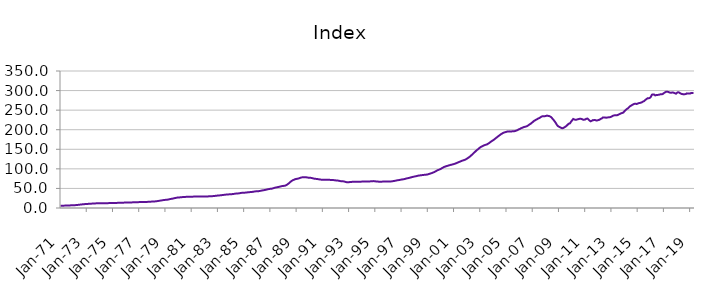
| Category | Index |
|---|---|
| 1971-01-01 | 5.879 |
| 1971-02-01 | 5.921 |
| 1971-03-01 | 5.963 |
| 1971-04-01 | 6.018 |
| 1971-05-01 | 6.108 |
| 1971-06-01 | 6.203 |
| 1971-07-01 | 6.32 |
| 1971-08-01 | 6.446 |
| 1971-09-01 | 6.572 |
| 1971-10-01 | 6.703 |
| 1971-11-01 | 6.844 |
| 1971-12-01 | 7.015 |
| 1972-01-01 | 7.135 |
| 1972-02-01 | 7.213 |
| 1972-03-01 | 7.39 |
| 1972-04-01 | 7.638 |
| 1972-05-01 | 7.997 |
| 1972-06-01 | 8.312 |
| 1972-07-01 | 8.674 |
| 1972-08-01 | 9.023 |
| 1972-09-01 | 9.332 |
| 1972-10-01 | 9.62 |
| 1972-11-01 | 9.887 |
| 1972-12-01 | 10.162 |
| 1973-01-01 | 10.359 |
| 1973-02-01 | 10.498 |
| 1973-03-01 | 10.658 |
| 1973-04-01 | 10.841 |
| 1973-05-01 | 11.075 |
| 1973-06-01 | 11.227 |
| 1973-07-01 | 11.386 |
| 1973-08-01 | 11.562 |
| 1973-09-01 | 11.768 |
| 1973-10-01 | 11.982 |
| 1973-11-01 | 12.145 |
| 1973-12-01 | 12.262 |
| 1974-01-01 | 12.324 |
| 1974-02-01 | 12.392 |
| 1974-03-01 | 12.389 |
| 1974-04-01 | 12.362 |
| 1974-05-01 | 12.339 |
| 1974-06-01 | 12.34 |
| 1974-07-01 | 12.352 |
| 1974-08-01 | 12.392 |
| 1974-09-01 | 12.465 |
| 1974-10-01 | 12.555 |
| 1974-11-01 | 12.63 |
| 1974-12-01 | 12.703 |
| 1975-01-01 | 12.737 |
| 1975-02-01 | 12.78 |
| 1975-03-01 | 12.857 |
| 1975-04-01 | 12.965 |
| 1975-05-01 | 13.097 |
| 1975-06-01 | 13.168 |
| 1975-07-01 | 13.237 |
| 1975-08-01 | 13.332 |
| 1975-09-01 | 13.462 |
| 1975-10-01 | 13.606 |
| 1975-11-01 | 13.732 |
| 1975-12-01 | 13.867 |
| 1976-01-01 | 13.963 |
| 1976-02-01 | 14.052 |
| 1976-03-01 | 14.114 |
| 1976-04-01 | 14.179 |
| 1976-05-01 | 14.264 |
| 1976-06-01 | 14.32 |
| 1976-07-01 | 14.382 |
| 1976-08-01 | 14.474 |
| 1976-09-01 | 14.605 |
| 1976-10-01 | 14.752 |
| 1976-11-01 | 14.87 |
| 1976-12-01 | 14.976 |
| 1977-01-01 | 15.034 |
| 1977-02-01 | 15.102 |
| 1977-03-01 | 15.145 |
| 1977-04-01 | 15.197 |
| 1977-05-01 | 15.276 |
| 1977-06-01 | 15.347 |
| 1977-07-01 | 15.436 |
| 1977-08-01 | 15.557 |
| 1977-09-01 | 15.705 |
| 1977-10-01 | 15.871 |
| 1977-11-01 | 16.048 |
| 1977-12-01 | 16.278 |
| 1978-01-01 | 16.449 |
| 1978-02-01 | 16.582 |
| 1978-03-01 | 16.762 |
| 1978-04-01 | 17.003 |
| 1978-05-01 | 17.391 |
| 1978-06-01 | 17.783 |
| 1978-07-01 | 18.258 |
| 1978-08-01 | 18.744 |
| 1978-09-01 | 19.213 |
| 1978-10-01 | 19.678 |
| 1978-11-01 | 20.113 |
| 1978-12-01 | 20.542 |
| 1979-01-01 | 20.797 |
| 1979-02-01 | 20.968 |
| 1979-03-01 | 21.394 |
| 1979-04-01 | 21.979 |
| 1979-05-01 | 22.725 |
| 1979-06-01 | 23.198 |
| 1979-07-01 | 23.69 |
| 1979-08-01 | 24.243 |
| 1979-09-01 | 24.906 |
| 1979-10-01 | 25.613 |
| 1979-11-01 | 26.202 |
| 1979-12-01 | 26.66 |
| 1980-01-01 | 26.911 |
| 1980-02-01 | 27.107 |
| 1980-03-01 | 27.357 |
| 1980-04-01 | 27.651 |
| 1980-05-01 | 27.994 |
| 1980-06-01 | 28.178 |
| 1980-07-01 | 28.344 |
| 1980-08-01 | 28.498 |
| 1980-09-01 | 28.607 |
| 1980-10-01 | 28.676 |
| 1980-11-01 | 28.73 |
| 1980-12-01 | 28.843 |
| 1981-01-01 | 28.911 |
| 1981-02-01 | 29.013 |
| 1981-03-01 | 29.116 |
| 1981-04-01 | 29.254 |
| 1981-05-01 | 29.394 |
| 1981-06-01 | 29.441 |
| 1981-07-01 | 29.464 |
| 1981-08-01 | 29.469 |
| 1981-09-01 | 29.414 |
| 1981-10-01 | 29.312 |
| 1981-11-01 | 29.219 |
| 1981-12-01 | 29.209 |
| 1982-01-01 | 29.164 |
| 1982-02-01 | 29.184 |
| 1982-03-01 | 29.346 |
| 1982-04-01 | 29.618 |
| 1982-05-01 | 29.924 |
| 1982-06-01 | 30.035 |
| 1982-07-01 | 30.119 |
| 1982-08-01 | 30.28 |
| 1982-09-01 | 30.54 |
| 1982-10-01 | 30.849 |
| 1982-11-01 | 31.157 |
| 1982-12-01 | 31.538 |
| 1983-01-01 | 31.828 |
| 1983-02-01 | 32.078 |
| 1983-03-01 | 32.337 |
| 1983-04-01 | 32.659 |
| 1983-05-01 | 33.081 |
| 1983-06-01 | 33.413 |
| 1983-07-01 | 33.773 |
| 1983-08-01 | 34.116 |
| 1983-09-01 | 34.39 |
| 1983-10-01 | 34.614 |
| 1983-11-01 | 34.826 |
| 1983-12-01 | 35.104 |
| 1984-01-01 | 35.27 |
| 1984-02-01 | 35.438 |
| 1984-03-01 | 35.758 |
| 1984-04-01 | 36.202 |
| 1984-05-01 | 36.71 |
| 1984-06-01 | 36.936 |
| 1984-07-01 | 37.124 |
| 1984-08-01 | 37.411 |
| 1984-09-01 | 37.87 |
| 1984-10-01 | 38.4 |
| 1984-11-01 | 38.81 |
| 1984-12-01 | 39.095 |
| 1985-01-01 | 39.174 |
| 1985-02-01 | 39.283 |
| 1985-03-01 | 39.552 |
| 1985-04-01 | 39.93 |
| 1985-05-01 | 40.361 |
| 1985-06-01 | 40.527 |
| 1985-07-01 | 40.681 |
| 1985-08-01 | 40.948 |
| 1985-09-01 | 41.393 |
| 1985-10-01 | 41.902 |
| 1985-11-01 | 42.329 |
| 1985-12-01 | 42.671 |
| 1986-01-01 | 42.803 |
| 1986-02-01 | 42.939 |
| 1986-03-01 | 43.335 |
| 1986-04-01 | 43.908 |
| 1986-05-01 | 44.624 |
| 1986-06-01 | 45.057 |
| 1986-07-01 | 45.499 |
| 1986-08-01 | 46.028 |
| 1986-09-01 | 46.692 |
| 1986-10-01 | 47.409 |
| 1986-11-01 | 48.06 |
| 1986-12-01 | 48.667 |
| 1987-01-01 | 49.02 |
| 1987-02-01 | 49.311 |
| 1987-03-01 | 49.944 |
| 1987-04-01 | 50.795 |
| 1987-05-01 | 51.813 |
| 1987-06-01 | 52.387 |
| 1987-07-01 | 52.937 |
| 1987-08-01 | 53.541 |
| 1987-09-01 | 54.197 |
| 1987-10-01 | 54.877 |
| 1987-11-01 | 55.513 |
| 1987-12-01 | 56.172 |
| 1988-01-01 | 56.486 |
| 1988-02-01 | 56.756 |
| 1988-03-01 | 57.701 |
| 1988-04-01 | 59.124 |
| 1988-05-01 | 61.264 |
| 1988-06-01 | 63.424 |
| 1988-07-01 | 65.968 |
| 1988-08-01 | 68.307 |
| 1988-09-01 | 70.109 |
| 1988-10-01 | 71.604 |
| 1988-11-01 | 72.807 |
| 1988-12-01 | 73.875 |
| 1989-01-01 | 74.434 |
| 1989-02-01 | 74.906 |
| 1989-03-01 | 75.707 |
| 1989-04-01 | 76.727 |
| 1989-05-01 | 77.807 |
| 1989-06-01 | 78.279 |
| 1989-07-01 | 78.601 |
| 1989-08-01 | 78.752 |
| 1989-09-01 | 78.622 |
| 1989-10-01 | 78.258 |
| 1989-11-01 | 77.774 |
| 1989-12-01 | 77.38 |
| 1990-01-01 | 77.025 |
| 1990-02-01 | 77.011 |
| 1990-03-01 | 76.482 |
| 1990-04-01 | 75.796 |
| 1990-05-01 | 74.994 |
| 1990-06-01 | 74.611 |
| 1990-07-01 | 74.285 |
| 1990-08-01 | 73.967 |
| 1990-09-01 | 73.52 |
| 1990-10-01 | 73.009 |
| 1990-11-01 | 72.535 |
| 1990-12-01 | 72.334 |
| 1991-01-01 | 72.192 |
| 1991-02-01 | 72.268 |
| 1991-03-01 | 72.153 |
| 1991-04-01 | 72.077 |
| 1991-05-01 | 71.977 |
| 1991-06-01 | 71.933 |
| 1991-07-01 | 71.885 |
| 1991-08-01 | 71.819 |
| 1991-09-01 | 71.705 |
| 1991-10-01 | 71.501 |
| 1991-11-01 | 71.166 |
| 1991-12-01 | 70.813 |
| 1992-01-01 | 70.463 |
| 1992-02-01 | 70.409 |
| 1992-03-01 | 69.918 |
| 1992-04-01 | 69.325 |
| 1992-05-01 | 68.671 |
| 1992-06-01 | 68.457 |
| 1992-07-01 | 68.303 |
| 1992-08-01 | 67.98 |
| 1992-09-01 | 67.29 |
| 1992-10-01 | 66.434 |
| 1992-11-01 | 65.854 |
| 1992-12-01 | 65.871 |
| 1993-01-01 | 66.034 |
| 1993-02-01 | 66.322 |
| 1993-03-01 | 66.581 |
| 1993-04-01 | 66.905 |
| 1993-05-01 | 67.182 |
| 1993-06-01 | 67.213 |
| 1993-07-01 | 67.233 |
| 1993-08-01 | 67.289 |
| 1993-09-01 | 67.247 |
| 1993-10-01 | 67.126 |
| 1993-11-01 | 67.046 |
| 1993-12-01 | 67.281 |
| 1994-01-01 | 67.604 |
| 1994-02-01 | 68.006 |
| 1994-03-01 | 67.991 |
| 1994-04-01 | 67.827 |
| 1994-05-01 | 67.683 |
| 1994-06-01 | 67.696 |
| 1994-07-01 | 67.777 |
| 1994-08-01 | 67.944 |
| 1994-09-01 | 68.21 |
| 1994-10-01 | 68.532 |
| 1994-11-01 | 68.685 |
| 1994-12-01 | 68.595 |
| 1995-01-01 | 68.092 |
| 1995-02-01 | 67.66 |
| 1995-03-01 | 67.497 |
| 1995-04-01 | 67.327 |
| 1995-05-01 | 67.356 |
| 1995-06-01 | 67.213 |
| 1995-07-01 | 67.36 |
| 1995-08-01 | 67.425 |
| 1995-09-01 | 67.463 |
| 1995-10-01 | 67.439 |
| 1995-11-01 | 67.524 |
| 1995-12-01 | 67.607 |
| 1996-01-01 | 67.632 |
| 1996-02-01 | 67.59 |
| 1996-03-01 | 67.814 |
| 1996-04-01 | 68.077 |
| 1996-05-01 | 68.578 |
| 1996-06-01 | 68.945 |
| 1996-07-01 | 69.543 |
| 1996-08-01 | 70.122 |
| 1996-09-01 | 70.708 |
| 1996-10-01 | 71.134 |
| 1996-11-01 | 71.585 |
| 1996-12-01 | 72.224 |
| 1997-01-01 | 72.682 |
| 1997-02-01 | 73.17 |
| 1997-03-01 | 73.587 |
| 1997-04-01 | 74.264 |
| 1997-05-01 | 75.148 |
| 1997-06-01 | 75.819 |
| 1997-07-01 | 76.292 |
| 1997-08-01 | 77.048 |
| 1997-09-01 | 77.723 |
| 1997-10-01 | 78.598 |
| 1997-11-01 | 79.21 |
| 1997-12-01 | 79.988 |
| 1998-01-01 | 80.449 |
| 1998-02-01 | 81.141 |
| 1998-03-01 | 81.745 |
| 1998-04-01 | 82.495 |
| 1998-05-01 | 83.027 |
| 1998-06-01 | 83.355 |
| 1998-07-01 | 83.747 |
| 1998-08-01 | 84.113 |
| 1998-09-01 | 84.484 |
| 1998-10-01 | 84.731 |
| 1998-11-01 | 85.018 |
| 1998-12-01 | 85.363 |
| 1999-01-01 | 85.875 |
| 1999-02-01 | 86.896 |
| 1999-03-01 | 87.796 |
| 1999-04-01 | 88.688 |
| 1999-05-01 | 89.666 |
| 1999-06-01 | 90.701 |
| 1999-07-01 | 91.918 |
| 1999-08-01 | 93.495 |
| 1999-09-01 | 95.101 |
| 1999-10-01 | 96.577 |
| 1999-11-01 | 97.58 |
| 1999-12-01 | 98.926 |
| 2000-01-01 | 100 |
| 2000-02-01 | 101.936 |
| 2000-03-01 | 103.455 |
| 2000-04-01 | 105.075 |
| 2000-05-01 | 105.895 |
| 2000-06-01 | 106.901 |
| 2000-07-01 | 107.798 |
| 2000-08-01 | 108.633 |
| 2000-09-01 | 109.409 |
| 2000-10-01 | 110.207 |
| 2000-11-01 | 110.863 |
| 2000-12-01 | 111.699 |
| 2001-01-01 | 112.376 |
| 2001-02-01 | 113.427 |
| 2001-03-01 | 114.41 |
| 2001-04-01 | 115.617 |
| 2001-05-01 | 116.92 |
| 2001-06-01 | 118 |
| 2001-07-01 | 119.178 |
| 2001-08-01 | 120.352 |
| 2001-09-01 | 121.415 |
| 2001-10-01 | 122.129 |
| 2001-11-01 | 123.346 |
| 2001-12-01 | 124.695 |
| 2002-01-01 | 126.498 |
| 2002-02-01 | 128.249 |
| 2002-03-01 | 130.341 |
| 2002-04-01 | 132.594 |
| 2002-05-01 | 135.137 |
| 2002-06-01 | 137.714 |
| 2002-07-01 | 140.534 |
| 2002-08-01 | 143.04 |
| 2002-09-01 | 145.7 |
| 2002-10-01 | 148.191 |
| 2002-11-01 | 150.379 |
| 2002-12-01 | 152.788 |
| 2003-01-01 | 154.938 |
| 2003-02-01 | 156.702 |
| 2003-03-01 | 158.127 |
| 2003-04-01 | 159.492 |
| 2003-05-01 | 160.649 |
| 2003-06-01 | 161.58 |
| 2003-07-01 | 162.401 |
| 2003-08-01 | 164.014 |
| 2003-09-01 | 165.699 |
| 2003-10-01 | 167.901 |
| 2003-11-01 | 170.039 |
| 2003-12-01 | 171.829 |
| 2004-01-01 | 173.609 |
| 2004-02-01 | 175.589 |
| 2004-03-01 | 177.991 |
| 2004-04-01 | 180.138 |
| 2004-05-01 | 182.465 |
| 2004-06-01 | 184.54 |
| 2004-07-01 | 186.551 |
| 2004-08-01 | 188.625 |
| 2004-09-01 | 190.257 |
| 2004-10-01 | 192.019 |
| 2004-11-01 | 192.962 |
| 2004-12-01 | 193.904 |
| 2005-01-01 | 194.627 |
| 2005-02-01 | 195.72 |
| 2005-03-01 | 195.655 |
| 2005-04-01 | 195.754 |
| 2005-05-01 | 195.194 |
| 2005-06-01 | 195.793 |
| 2005-07-01 | 195.867 |
| 2005-08-01 | 196.175 |
| 2005-09-01 | 196.736 |
| 2005-10-01 | 197.938 |
| 2005-11-01 | 198.884 |
| 2005-12-01 | 200.645 |
| 2006-01-01 | 201.661 |
| 2006-02-01 | 203.374 |
| 2006-03-01 | 204.511 |
| 2006-04-01 | 205.861 |
| 2006-05-01 | 206.826 |
| 2006-06-01 | 207.511 |
| 2006-07-01 | 208.388 |
| 2006-08-01 | 209.567 |
| 2006-09-01 | 211.353 |
| 2006-10-01 | 213.443 |
| 2006-11-01 | 215.14 |
| 2006-12-01 | 217.475 |
| 2007-01-01 | 219.496 |
| 2007-02-01 | 222.231 |
| 2007-03-01 | 223.7 |
| 2007-04-01 | 225.58 |
| 2007-05-01 | 226.869 |
| 2007-06-01 | 228.812 |
| 2007-07-01 | 229.701 |
| 2007-08-01 | 231.63 |
| 2007-09-01 | 233.384 |
| 2007-10-01 | 234.664 |
| 2007-11-01 | 234.312 |
| 2007-12-01 | 234.555 |
| 2008-01-01 | 235.086 |
| 2008-02-01 | 236.026 |
| 2008-03-01 | 235.364 |
| 2008-04-01 | 234.965 |
| 2008-05-01 | 233.6 |
| 2008-06-01 | 231.702 |
| 2008-07-01 | 228.29 |
| 2008-08-01 | 225.152 |
| 2008-09-01 | 221.485 |
| 2008-10-01 | 217.485 |
| 2008-11-01 | 212.758 |
| 2008-12-01 | 209.323 |
| 2009-01-01 | 207.652 |
| 2009-02-01 | 206.212 |
| 2009-03-01 | 204.576 |
| 2009-04-01 | 203.86 |
| 2009-05-01 | 204.572 |
| 2009-06-01 | 206.247 |
| 2009-07-01 | 207.906 |
| 2009-08-01 | 210.209 |
| 2009-09-01 | 213.072 |
| 2009-10-01 | 215.548 |
| 2009-11-01 | 216.169 |
| 2009-12-01 | 220.435 |
| 2010-01-01 | 223.882 |
| 2010-02-01 | 227.544 |
| 2010-03-01 | 226.207 |
| 2010-04-01 | 225.371 |
| 2010-05-01 | 225.616 |
| 2010-06-01 | 226.496 |
| 2010-07-01 | 227.242 |
| 2010-08-01 | 228.031 |
| 2010-09-01 | 227.934 |
| 2010-10-01 | 227.086 |
| 2010-11-01 | 225.565 |
| 2010-12-01 | 225.597 |
| 2011-01-01 | 226.214 |
| 2011-02-01 | 228.039 |
| 2011-03-01 | 228.503 |
| 2011-04-01 | 226.162 |
| 2011-05-01 | 223.102 |
| 2011-06-01 | 221.419 |
| 2011-07-01 | 222.781 |
| 2011-08-01 | 224.513 |
| 2011-09-01 | 224.472 |
| 2011-10-01 | 224.841 |
| 2011-11-01 | 223.579 |
| 2011-12-01 | 223.822 |
| 2012-01-01 | 224.584 |
| 2012-02-01 | 225.473 |
| 2012-03-01 | 227.466 |
| 2012-04-01 | 228.575 |
| 2012-05-01 | 231.11 |
| 2012-06-01 | 231.251 |
| 2012-07-01 | 231.282 |
| 2012-08-01 | 230.612 |
| 2012-09-01 | 231.126 |
| 2012-10-01 | 231.503 |
| 2012-11-01 | 231.747 |
| 2012-12-01 | 232.346 |
| 2013-01-01 | 233.26 |
| 2013-02-01 | 235.199 |
| 2013-03-01 | 236.287 |
| 2013-04-01 | 236.897 |
| 2013-05-01 | 236.822 |
| 2013-06-01 | 237.016 |
| 2013-07-01 | 237.888 |
| 2013-08-01 | 239.493 |
| 2013-09-01 | 240.786 |
| 2013-10-01 | 242.115 |
| 2013-11-01 | 242.898 |
| 2013-12-01 | 244.057 |
| 2014-01-01 | 247.816 |
| 2014-02-01 | 250.169 |
| 2014-03-01 | 252.769 |
| 2014-04-01 | 254.326 |
| 2014-05-01 | 257.246 |
| 2014-06-01 | 260.069 |
| 2014-07-01 | 261.53 |
| 2014-08-01 | 263.472 |
| 2014-09-01 | 264.905 |
| 2014-10-01 | 266.07 |
| 2014-11-01 | 266.347 |
| 2014-12-01 | 265.659 |
| 2015-01-01 | 266.928 |
| 2015-02-01 | 267.88 |
| 2015-03-01 | 268.307 |
| 2015-04-01 | 269.155 |
| 2015-05-01 | 270.34 |
| 2015-06-01 | 272.163 |
| 2015-07-01 | 273.277 |
| 2015-08-01 | 276.288 |
| 2015-09-01 | 278.116 |
| 2015-10-01 | 280.486 |
| 2015-11-01 | 280.294 |
| 2015-12-01 | 281.199 |
| 2016-01-01 | 283.607 |
| 2016-02-01 | 289.619 |
| 2016-03-01 | 290.057 |
| 2016-04-01 | 289.886 |
| 2016-05-01 | 287.681 |
| 2016-06-01 | 288.483 |
| 2016-07-01 | 288.661 |
| 2016-08-01 | 289.259 |
| 2016-09-01 | 289.711 |
| 2016-10-01 | 290.701 |
| 2016-11-01 | 290.463 |
| 2016-12-01 | 291.375 |
| 2017-01-01 | 293.717 |
| 2017-02-01 | 295.456 |
| 2017-03-01 | 297.078 |
| 2017-04-01 | 296.912 |
| 2017-05-01 | 296.553 |
| 2017-06-01 | 295.078 |
| 2017-07-01 | 294.677 |
| 2017-08-01 | 294.669 |
| 2017-09-01 | 295.305 |
| 2017-10-01 | 294.345 |
| 2017-11-01 | 293.162 |
| 2017-12-01 | 292.069 |
| 2018-01-01 | 294.449 |
| 2018-02-01 | 295.846 |
| 2018-03-01 | 294.92 |
| 2018-04-01 | 292.924 |
| 2018-05-01 | 291.472 |
| 2018-06-01 | 291.002 |
| 2018-07-01 | 290.236 |
| 2018-08-01 | 290.758 |
| 2018-09-01 | 291.058 |
| 2018-10-01 | 292.824 |
| 2018-11-01 | 292.65 |
| 2018-12-01 | 292.367 |
| 2019-01-01 | 292.402 |
| 2019-02-01 | 294.034 |
| 2019-03-01 | 293.963 |
| 2019-04-01 | 293.788 |